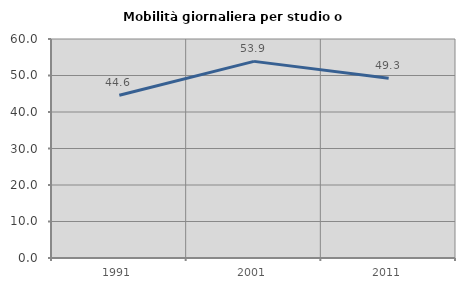
| Category | Mobilità giornaliera per studio o lavoro |
|---|---|
| 1991.0 | 44.589 |
| 2001.0 | 53.872 |
| 2011.0 | 49.27 |